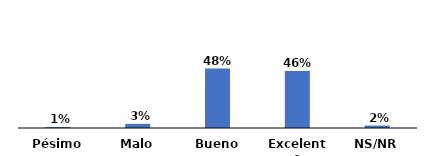
| Category | Series 0 |
|---|---|
| Pésimo | 0.008 |
| Malo | 0.033 |
| Bueno | 0.48 |
| Excelente | 0.46 |
| NS/NR | 0.02 |